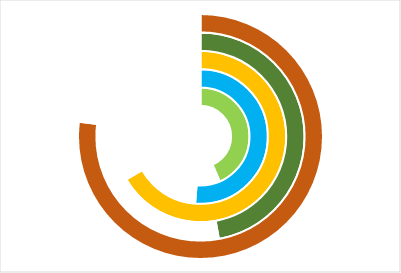
| Category | Jan | Feb | Mar | Apr | May |
|---|---|---|---|---|---|
| 0 | 850 | 1000 | 1300 | 920 | 1500 |
| 1 | 1100 | 950 | 650 | 1030 | 450 |